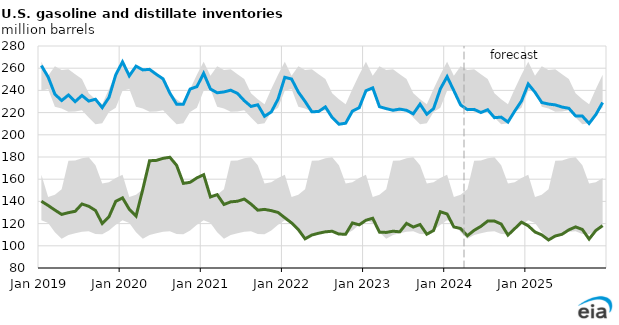
| Category | Distillate inventories | Gasoline inventories |
|---|---|---|
| 2019-01-01 | 140.129 | 262.366 |
| 2019-02-01 | 136.323 | 252.058 |
| 2019-03-01 | 132.172 | 236.555 |
| 2019-04-01 | 128.274 | 230.869 |
| 2019-05-01 | 129.865 | 235.83 |
| 2019-06-01 | 131.094 | 229.914 |
| 2019-07-01 | 137.674 | 235.434 |
| 2019-08-01 | 135.636 | 230.362 |
| 2019-09-01 | 131.838 | 232.043 |
| 2019-10-01 | 120.073 | 224.473 |
| 2019-11-01 | 126.221 | 233.691 |
| 2019-12-01 | 140.083 | 254.1 |
| 2020-01-01 | 143.19 | 265.711 |
| 2020-02-01 | 132.918 | 253.091 |
| 2020-03-01 | 126.782 | 261.823 |
| 2020-04-01 | 150.922 | 258.463 |
| 2020-05-01 | 176.627 | 258.952 |
| 2020-06-01 | 176.947 | 254.479 |
| 2020-07-01 | 178.8 | 250.36 |
| 2020-08-01 | 179.763 | 237.534 |
| 2020-09-01 | 172.502 | 227.578 |
| 2020-10-01 | 156.235 | 227.616 |
| 2020-11-01 | 157.205 | 241.23 |
| 2020-12-01 | 161.188 | 243.395 |
| 2021-01-01 | 164.058 | 255.362 |
| 2021-02-01 | 144.012 | 241.273 |
| 2021-03-01 | 146.079 | 237.846 |
| 2021-04-01 | 137.218 | 238.622 |
| 2021-05-01 | 139.6 | 240.176 |
| 2021-06-01 | 140.133 | 237.286 |
| 2021-07-01 | 142.139 | 230.765 |
| 2021-08-01 | 137.625 | 225.551 |
| 2021-09-01 | 132.095 | 227.048 |
| 2021-10-01 | 132.811 | 216.696 |
| 2021-11-01 | 131.692 | 220.598 |
| 2021-12-01 | 130.039 | 232.178 |
| 2022-01-01 | 125.282 | 251.781 |
| 2022-02-01 | 120.61 | 250.261 |
| 2022-03-01 | 114.658 | 238.502 |
| 2022-04-01 | 106.291 | 230.019 |
| 2022-05-01 | 109.712 | 220.722 |
| 2022-06-01 | 111.329 | 221.016 |
| 2022-07-01 | 112.591 | 225.133 |
| 2022-08-01 | 113.122 | 215.591 |
| 2022-09-01 | 110.531 | 209.516 |
| 2022-10-01 | 110.492 | 210.444 |
| 2022-11-01 | 120.601 | 221.354 |
| 2022-12-01 | 118.899 | 224.41 |
| 2023-01-01 | 123.013 | 239.706 |
| 2023-02-01 | 124.821 | 242.298 |
| 2023-03-01 | 112.292 | 225.333 |
| 2023-04-01 | 112.061 | 223.591 |
| 2023-05-01 | 113.14 | 222.113 |
| 2023-06-01 | 112.598 | 223.162 |
| 2023-07-01 | 120.208 | 222.05 |
| 2023-08-01 | 116.89 | 218.901 |
| 2023-09-01 | 119.17 | 227.622 |
| 2023-10-01 | 110.433 | 218.54 |
| 2023-11-01 | 113.783 | 223.607 |
| 2023-12-01 | 130.713 | 241.321 |
| 2024-01-01 | 128.691 | 252.392 |
| 2024-02-01 | 117.01 | 239.744 |
| 2024-03-01 | 115.57 | 226.864 |
| 2024-04-01 | 109.056 | 222.667 |
| 2024-05-01 | 113.945 | 222.901 |
| 2024-06-01 | 117.543 | 220.049 |
| 2024-07-01 | 122.272 | 222.572 |
| 2024-08-01 | 122.309 | 215.437 |
| 2024-09-01 | 119.603 | 215.909 |
| 2024-10-01 | 109.646 | 211.484 |
| 2024-11-01 | 115.466 | 221.322 |
| 2024-12-01 | 121.312 | 230.462 |
| 2025-01-01 | 118.022 | 245.775 |
| 2025-02-01 | 112.418 | 238.345 |
| 2025-03-01 | 109.842 | 229.091 |
| 2025-04-01 | 105.244 | 227.696 |
| 2025-05-01 | 108.833 | 226.944 |
| 2025-06-01 | 110.376 | 224.998 |
| 2025-07-01 | 114.352 | 223.888 |
| 2025-08-01 | 117.006 | 217.042 |
| 2025-09-01 | 114.721 | 216.875 |
| 2025-10-01 | 106.064 | 210.2 |
| 2025-11-01 | 113.816 | 218.217 |
| 2025-12-01 | 118.149 | 229.093 |